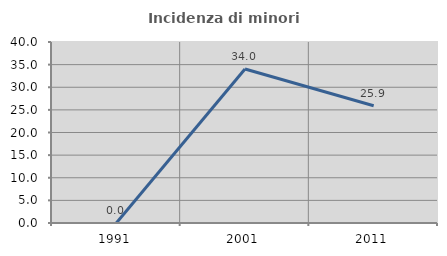
| Category | Incidenza di minori stranieri |
|---|---|
| 1991.0 | 0 |
| 2001.0 | 34.043 |
| 2011.0 | 25.926 |